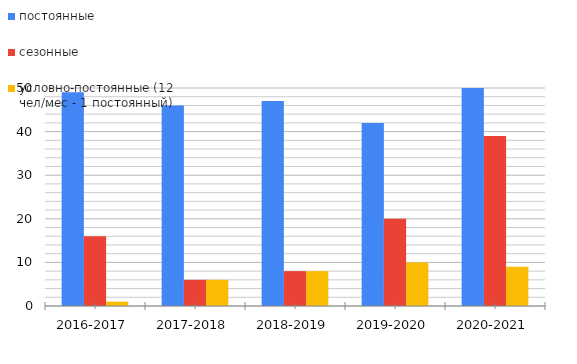
| Category | постоянные | сезонные  | условно-постоянные (12 чел/мес - 1 постоянный) |
|---|---|---|---|
| 2016-2017 | 49 | 16 | 1 |
| 2017-2018 | 46 | 6 | 6 |
| 2018-2019 | 47 | 8 | 8 |
| 2019-2020 | 42 | 20 | 10 |
| 2020-2021 | 50 | 39 | 9 |